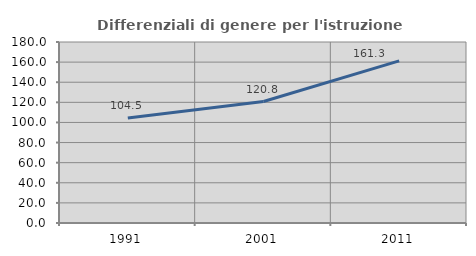
| Category | Differenziali di genere per l'istruzione superiore |
|---|---|
| 1991.0 | 104.478 |
| 2001.0 | 120.784 |
| 2011.0 | 161.278 |